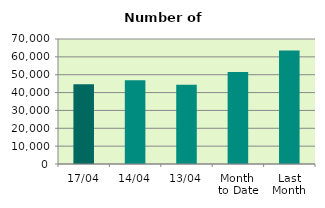
| Category | Series 0 |
|---|---|
| 17/04 | 44698 |
| 14/04 | 46858 |
| 13/04 | 44350 |
| Month 
to Date | 51568.222 |
| Last
Month | 63497.391 |